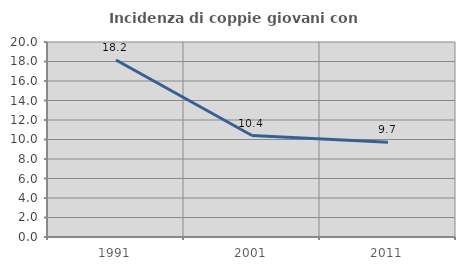
| Category | Incidenza di coppie giovani con figli |
|---|---|
| 1991.0 | 18.157 |
| 2001.0 | 10.41 |
| 2011.0 | 9.712 |